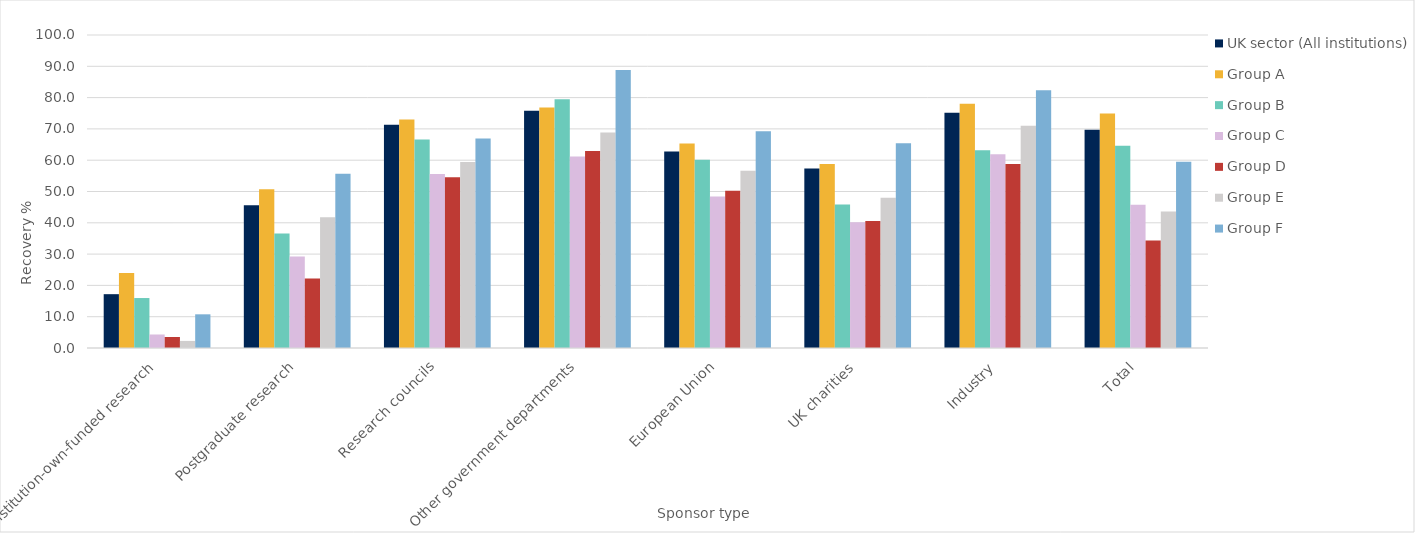
| Category | UK sector (All institutions) | Group A | Group B | Group C | Group D | Group E | Group F |
|---|---|---|---|---|---|---|---|
| 0 | 17.197 | 23.933 | 15.964 | 4.315 | 3.523 | 2.262 | 10.761 |
| 1 | 45.6 | 50.732 | 36.574 | 29.219 | 22.171 | 41.734 | 55.683 |
| 2 | 71.33 | 73.031 | 66.583 | 55.567 | 54.519 | 59.409 | 66.952 |
| 3 | 75.821 | 76.812 | 79.499 | 61.215 | 62.91 | 68.878 | 88.822 |
| 4 | 62.797 | 65.316 | 60.153 | 48.368 | 50.228 | 56.604 | 69.276 |
| 5 | 57.358 | 58.763 | 45.863 | 40.189 | 40.575 | 48.026 | 65.426 |
| 6 | 75.171 | 78.058 | 63.145 | 61.913 | 58.759 | 71.035 | 82.374 |
| 7 | 69.715 | 74.886 | 64.635 | 45.742 | 34.359 | 43.584 | 59.492 |